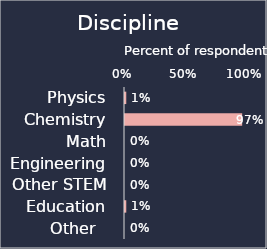
| Category | % of respondents |
|---|---|
| Physics | 0.011 |
| Chemistry | 0.968 |
| Math | 0 |
| Engineering | 0 |
| Other STEM | 0 |
| Education | 0.011 |
| Other   | 0 |